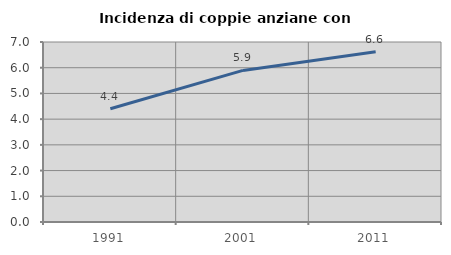
| Category | Incidenza di coppie anziane con figli |
|---|---|
| 1991.0 | 4.403 |
| 2001.0 | 5.895 |
| 2011.0 | 6.619 |